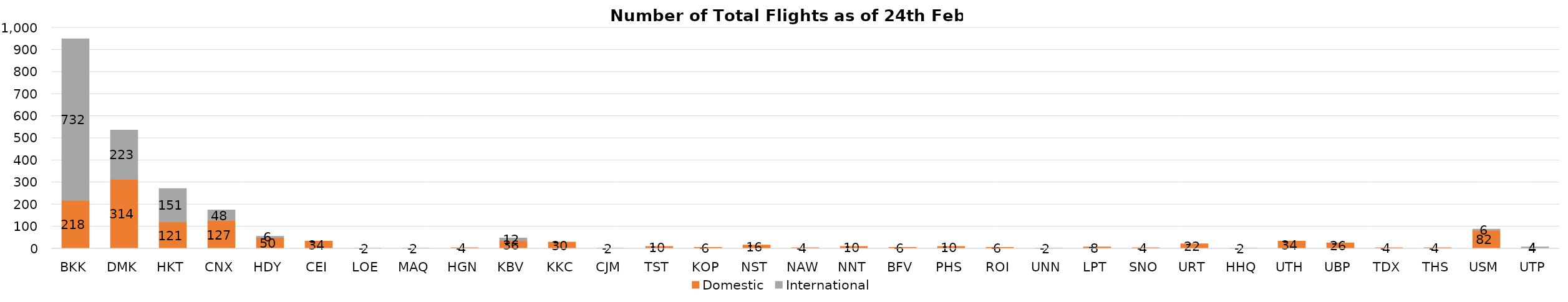
| Category | Domestic | International |
|---|---|---|
| BKK | 218 | 732 |
| DMK | 314 | 223 |
| HKT | 121 | 151 |
| CNX | 127 | 48 |
| HDY | 50 | 6 |
| CEI | 34 | 0 |
| LOE | 2 | 0 |
| MAQ | 2 | 0 |
| HGN | 4 | 0 |
| KBV | 36 | 12 |
| KKC | 30 | 0 |
| CJM | 2 | 0 |
| TST | 10 | 0 |
| KOP | 6 | 0 |
| NST | 16 | 0 |
| NAW | 4 | 0 |
| NNT | 10 | 0 |
| BFV | 6 | 0 |
| PHS | 10 | 0 |
| ROI | 6 | 0 |
| UNN | 2 | 0 |
| LPT | 8 | 0 |
| SNO | 4 | 0 |
| URT | 22 | 0 |
| HHQ | 2 | 0 |
| UTH | 34 | 0 |
| UBP | 26 | 0 |
| TDX | 4 | 0 |
| THS | 4 | 0 |
| USM | 82 | 6 |
| UTP | 4 | 4 |